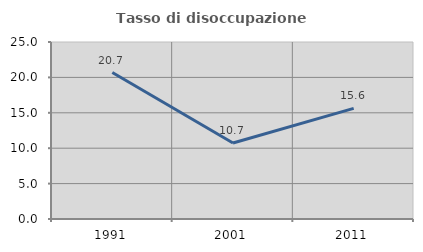
| Category | Tasso di disoccupazione giovanile  |
|---|---|
| 1991.0 | 20.69 |
| 2001.0 | 10.734 |
| 2011.0 | 15.625 |